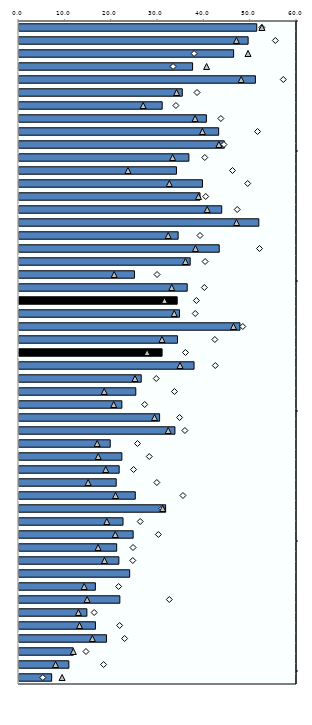
| Category | 25-64 |
|---|---|
| 0 | 51.314 |
| 1 | 49.453 |
| 2 | 46.323 |
| 3 | 37.464 |
| 4 | 51.029 |
| 5 | 35.243 |
| 6 | 30.904 |
| 7 | 40.442 |
| 8 | 43.094 |
| 9 | 44.313 |
| 10 | 36.666 |
| 11 | 33.98 |
| 12 | 39.6 |
| 13 | 39.069 |
| 14 | 43.751 |
| 15 | 51.761 |
| 16 | 34.347 |
| 17 | 43.216 |
| 18 | 36.949 |
| 19 | 24.911 |
| 20 | 36.308 |
| 21 | 34.143 |
| 22 | 34.64 |
| 23 | 47.689 |
| 24 | 34.211 |
| 25 | 30.883 |
| 26 | 37.782 |
| 27 | 26.375 |
| 28 | 25.206 |
| 29 | 22.2 |
| 30 | 30.346 |
| 31 | 33.657 |
| 32 | 19.693 |
| 33 | 22.2 |
| 34 | 21.623 |
| 35 | 20.984 |
| 36 | 25.1 |
| 37 | 31.651 |
| 38 | 22.451 |
| 39 | 24.638 |
| 40 | 21.082 |
| 41 | 21.556 |
| 42 | 23.89 |
| 43 | 16.486 |
| 44 | 21.767 |
| 45 | 14.652 |
| 46 | 16.5 |
| 47 | 18.879 |
| 48 | 11.721 |
| 49 | 10.76 |
| 50 | 7.05 |